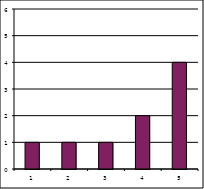
| Category | Series 1 |
|---|---|
| 0 | 1 |
| 1 | 1 |
| 2 | 1 |
| 3 | 2 |
| 4 | 4 |